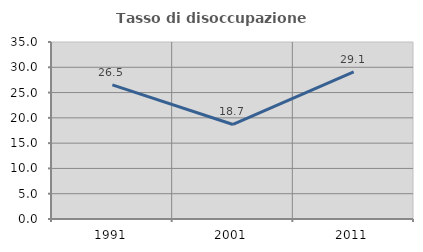
| Category | Tasso di disoccupazione giovanile  |
|---|---|
| 1991.0 | 26.532 |
| 2001.0 | 18.691 |
| 2011.0 | 29.088 |